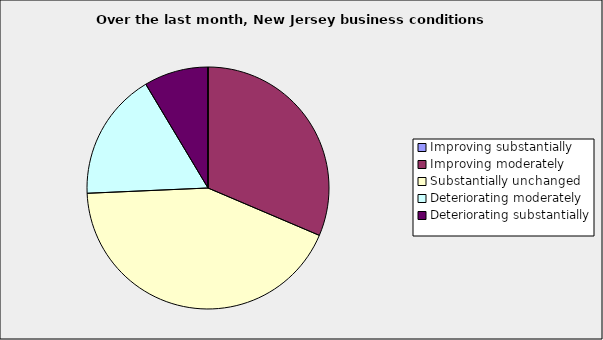
| Category | Series 0 |
|---|---|
| Improving substantially | 0 |
| Improving moderately | 0.314 |
| Substantially unchanged | 0.429 |
| Deteriorating moderately | 0.171 |
| Deteriorating substantially | 0.086 |